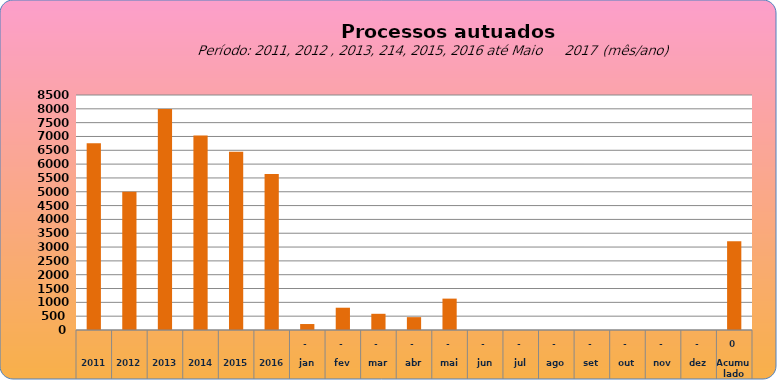
| Category | 6755 |
|---|---|
| 2011 | 6755 |
| 2012 | 4997 |
| 2013 | 7990 |
| 2014 | 7034 |
| 2015 | 6446 |
| 2016 | 5644 |
| jan | 216 |
| fev | 806 |
| mar | 586 |
| abr | 465 |
| mai | 1135 |
| jun | 0 |
| jul | 0 |
| ago | 0 |
| set | 0 |
| out | 0 |
| nov | 0 |
| dez | 0 |
| Acumulado
 | 3208 |